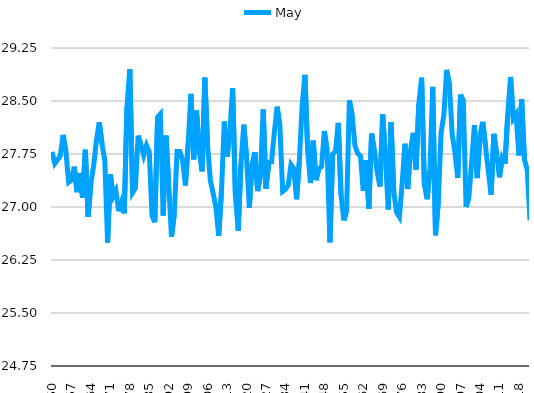
| Category | May |
|---|---|
| 1850 | 27.78 |
| 1851 | 27.615 |
| 1852 | 27.67 |
| 1853 | 27.725 |
| 1854 | 28.02 |
| 1855 | 27.785 |
| 1856 | 27.35 |
| 1857 | 27.38 |
| 1858 | 27.57 |
| 1859 | 27.21 |
| 1860 | 27.48 |
| 1861 | 27.13 |
| 1862 | 27.81 |
| 1863 | 26.86 |
| 1864 | 27.34 |
| 1865 | 27.59 |
| 1866 | 27.94 |
| 1867 | 28.2 |
| 1868 | 27.89 |
| 1869 | 27.66 |
| 1870 | 26.495 |
| 1871 | 27.46 |
| 1872 | 27.15 |
| 1873 | 27.23 |
| 1874 | 26.94 |
| 1875 | 27.065 |
| 1876 | 26.91 |
| 1877 | 28.43 |
| 1878 | 28.95 |
| 1879 | 27.205 |
| 1880 | 27.27 |
| 1881 | 28.01 |
| 1882 | 27.88 |
| 1883 | 27.73 |
| 1884 | 27.87 |
| 1885 | 27.78 |
| 1886 | 26.875 |
| 1887 | 26.785 |
| 1888 | 28.27 |
| 1889 | 28.315 |
| 1890 | 26.88 |
| 1891 | 28.01 |
| 1892 | 27.325 |
| 1893 | 26.58 |
| 1894 | 26.9 |
| 1895 | 27.785 |
| 1896 | 27.785 |
| 1897 | 27.66 |
| 1898 | 27.305 |
| 1899 | 27.905 |
| 1900 | 28.6 |
| 1901 | 27.675 |
| 1902 | 28.365 |
| 1903 | 27.79 |
| 1904 | 27.505 |
| 1905 | 28.83 |
| 1906 | 27.86 |
| 1907 | 27.37 |
| 1908 | 27.19 |
| 1909 | 26.99 |
| 1910 | 26.59 |
| 1911 | 27.24 |
| 1912 | 28.21 |
| 1913 | 27.71 |
| 1914 | 28.06 |
| 1915 | 28.68 |
| 1916 | 27.165 |
| 1917 | 26.665 |
| 1918 | 27.61 |
| 1919 | 28.165 |
| 1920 | 27.71 |
| 1921 | 26.99 |
| 1922 | 27.61 |
| 1923 | 27.775 |
| 1924 | 27.225 |
| 1925 | 27.45 |
| 1926 | 28.38 |
| 1927 | 27.26 |
| 1928 | 27.635 |
| 1929 | 27.64 |
| 1930 | 28.05 |
| 1931 | 28.42 |
| 1932 | 28.145 |
| 1933 | 27.22 |
| 1934 | 27.25 |
| 1935 | 27.31 |
| 1936 | 27.6 |
| 1937 | 27.545 |
| 1938 | 27.11 |
| 1939 | 27.645 |
| 1940 | 28.43 |
| 1941 | 28.87 |
| 1942 | 27.8 |
| 1943 | 27.34 |
| 1944 | 27.94 |
| 1945 | 27.38 |
| 1946 | 27.54 |
| 1947 | 27.57 |
| 1948 | 28.075 |
| 1949 | 27.8 |
| 1950 | 26.5 |
| 1951 | 27.75 |
| 1952 | 27.79 |
| 1953 | 28.19 |
| 1954 | 27.18 |
| 1955 | 26.81 |
| 1956 | 26.945 |
| 1957 | 28.51 |
| 1958 | 28.3 |
| 1959 | 27.87 |
| 1960 | 27.76 |
| 1961 | 27.72 |
| 1962 | 27.23 |
| 1963 | 27.66 |
| 1964 | 26.976 |
| 1965 | 28.04 |
| 1966 | 27.79 |
| 1967 | 27.5 |
| 1968 | 27.29 |
| 1969 | 28.31 |
| 1970 | 27.68 |
| 1971 | 26.965 |
| 1972 | 28.2 |
| 1973 | 27.21 |
| 1974 | 26.925 |
| 1975 | 26.86 |
| 1976 | 27.335 |
| 1977 | 27.895 |
| 1978 | 27.255 |
| 1979 | 27.805 |
| 1980 | 28.05 |
| 1981 | 27.53 |
| 1982 | 28.46 |
| 1983 | 28.83 |
| 1984 | 27.31 |
| 1985 | 27.11 |
| 1986 | 27.53 |
| 1987 | 28.7 |
| 1988 | 26.6 |
| 1989 | 27.07 |
| 1990 | 28.05 |
| 1991 | 28.3 |
| 1992 | 28.94 |
| 1993 | 28.73 |
| 1994 | 28.03 |
| 1995 | 27.77 |
| 1996 | 27.41 |
| 1997 | 28.59 |
| 1998 | 28.5 |
| 1999 | 27 |
| 2000 | 27.14 |
| 2001 | 27.63 |
| 2002 | 28.16 |
| 2003 | 27.41 |
| 2004 | 28.01 |
| 2005 | 28.205 |
| 2006 | 27.86 |
| 2007 | 27.507 |
| 2008 | 27.175 |
| 2009 | 28.035 |
| 2010 | 27.755 |
| 2011 | 27.42 |
| 2012 | 27.69 |
| 2013 | 27.61 |
| 2014 | 28.31 |
| 2015 | 28.84 |
| 2016 | 28.25 |
| 2017 | 28.31 |
| 2018 | 27.73 |
| 2019 | 28.525 |
| 2020 | 27.67 |
| 2021 | 27.53 |
| 2022 | 26.815 |